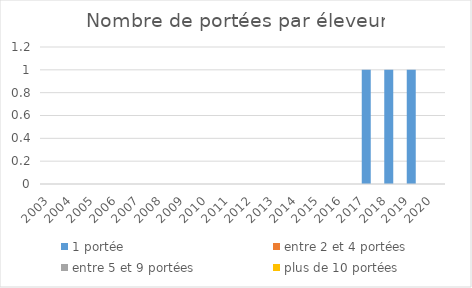
| Category | 1 portée | entre 2 et 4 portées | entre 5 et 9 portées | plus de 10 portées |
|---|---|---|---|---|
| 2003.0 | 0 | 0 | 0 | 0 |
| 2004.0 | 0 | 0 | 0 | 0 |
| 2005.0 | 0 | 0 | 0 | 0 |
| 2006.0 | 0 | 0 | 0 | 0 |
| 2007.0 | 0 | 0 | 0 | 0 |
| 2008.0 | 0 | 0 | 0 | 0 |
| 2009.0 | 0 | 0 | 0 | 0 |
| 2010.0 | 0 | 0 | 0 | 0 |
| 2011.0 | 0 | 0 | 0 | 0 |
| 2012.0 | 0 | 0 | 0 | 0 |
| 2013.0 | 0 | 0 | 0 | 0 |
| 2014.0 | 0 | 0 | 0 | 0 |
| 2015.0 | 0 | 0 | 0 | 0 |
| 2016.0 | 0 | 0 | 0 | 0 |
| 2017.0 | 1 | 0 | 0 | 0 |
| 2018.0 | 1 | 0 | 0 | 0 |
| 2019.0 | 1 | 0 | 0 | 0 |
| 2020.0 | 0 | 0 | 0 | 0 |